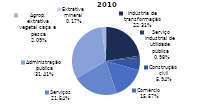
| Category | 2010 |
|---|---|
| Extrativa mineral | 782 |
| Indústria de transformação | 105087 |
| Serviço industrial de utilidade pública | 4618 |
| Construção civil | 27986 |
| Comércio | 73322 |
| Serviços | 101442 |
| Administração pública | 147926 |
| Agrop. extrativa vegetal caça e pesca | 9829 |